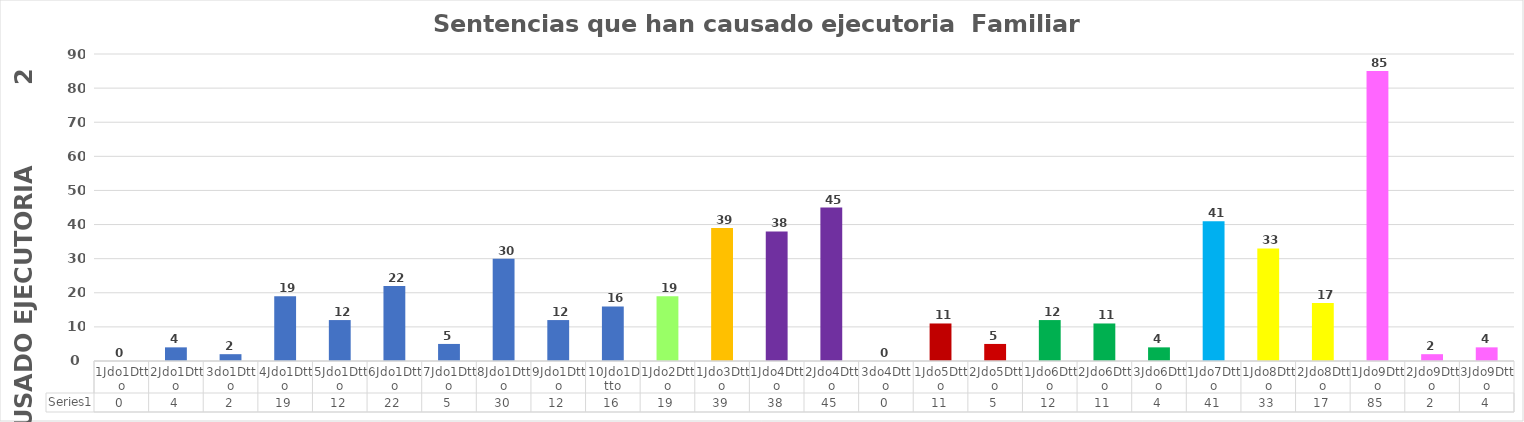
| Category | Series 0 |
|---|---|
| 1Jdo1Dtto | 0 |
| 2Jdo1Dtto | 4 |
| 3do1Dtto | 2 |
| 4Jdo1Dtto | 19 |
| 5Jdo1Dtto | 12 |
| 6Jdo1Dtto | 22 |
| 7Jdo1Dtto | 5 |
| 8Jdo1Dtto | 30 |
| 9Jdo1Dtto | 12 |
| 10Jdo1Dtto | 16 |
| 1Jdo2Dtto | 19 |
| 1Jdo3Dtto | 39 |
| 1Jdo4Dtto | 38 |
| 2Jdo4Dtto | 45 |
| 3do4Dtto | 0 |
| 1Jdo5Dtto | 11 |
| 2Jdo5Dtto | 5 |
| 1Jdo6Dtto | 12 |
| 2Jdo6Dtto | 11 |
| 3Jdo6Dtto | 4 |
| 1Jdo7Dtto | 41 |
| 1Jdo8Dtto | 33 |
| 2Jdo8Dtto | 17 |
| 1Jdo9Dtto | 85 |
| 2Jdo9Dtto | 2 |
| 3Jdo9Dtto | 4 |